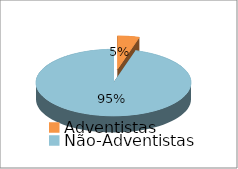
| Category | Series 0 |
|---|---|
| Adventistas | 5 |
| Não-Adventistas | 105 |